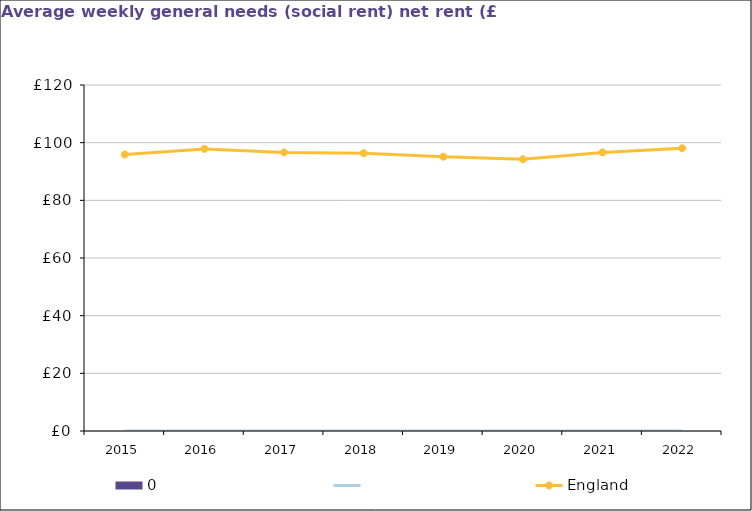
| Category | 0 |
|---|---|
| 2015.0 | 0 |
| 2016.0 | 0 |
| 2017.0 | 0 |
| 2018.0 | 0 |
| 2019.0 | 0 |
| 2020.0 | 0 |
| 2021.0 | 0 |
| 2022.0 | 0 |